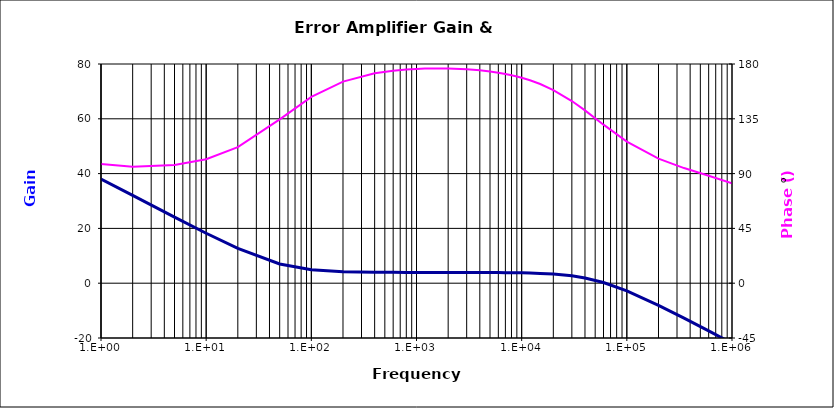
| Category | Error Amplifier Gain |
|---|---|
| 1.0 | 38.01 |
| 2.0 | 32.041 |
| 5.0 | 24.13 |
| 10.0 | 18.234 |
| 20.0 | 12.673 |
| 50.0 | 7.023 |
| 100.0 | 4.934 |
| 200.0 | 4.205 |
| 400.0 | 4.002 |
| 600.0 | 3.963 |
| 800.0 | 3.949 |
| 1000.0 | 3.942 |
| 1200.0 | 3.938 |
| 1500.0 | 3.934 |
| 2000.0 | 3.929 |
| 3000.0 | 3.92 |
| 4000.0 | 3.908 |
| 5000.0 | 3.893 |
| 6000.0 | 3.875 |
| 7000.0 | 3.855 |
| 8000.0 | 3.831 |
| 9000.0 | 3.804 |
| 10000.0 | 3.775 |
| 12000.0 | 3.707 |
| 15000.0 | 3.585 |
| 20000.0 | 3.333 |
| 30000.0 | 2.683 |
| 40000.0 | 1.911 |
| 60000.0 | 0.252 |
| 100000.0 | -2.793 |
| 200000.0 | -8.064 |
| 350000.0 | -12.75 |
| 600000.0 | -17.408 |
| 1000000.0 | -21.927 |